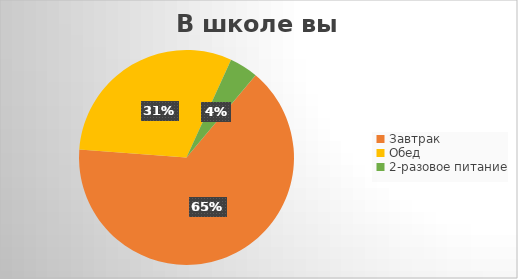
| Category | Series 0 |
|---|---|
| Завтрак | 136 |
| Обед | 64 |
| 2-разовое питание | 9 |